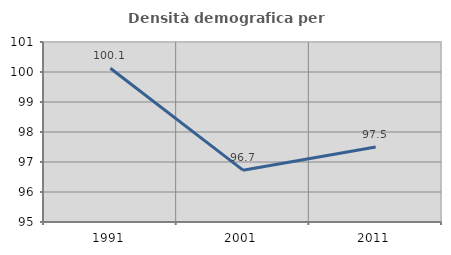
| Category | Densità demografica |
|---|---|
| 1991.0 | 100.125 |
| 2001.0 | 96.728 |
| 2011.0 | 97.501 |